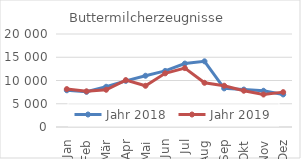
| Category | Jahr 2018 | Jahr 2019 |
|---|---|---|
| Jan | 7897.865 | 8151.235 |
| Feb | 7566.677 | 7672.036 |
| Mär | 8649.8 | 8011.53 |
| Apr | 9922.916 | 10090.155 |
| Mai | 11023.047 | 8862.729 |
| Jun | 12058.465 | 11541.027 |
| Jul | 13639.502 | 12663.293 |
| Aug | 14125.701 | 9505.931 |
| Sep | 8304.557 | 8875.885 |
| Okt | 8052.883 | 7799.974 |
| Nov | 7789.496 | 6988.078 |
| Dez | 7001.59 | 7500.896 |